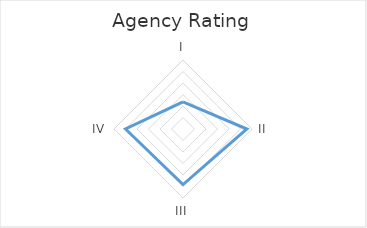
| Category | Series 0 |
|---|---|
| I | 1.182 |
| II | 2.778 |
| III | 2.417 |
| IV | 2.5 |